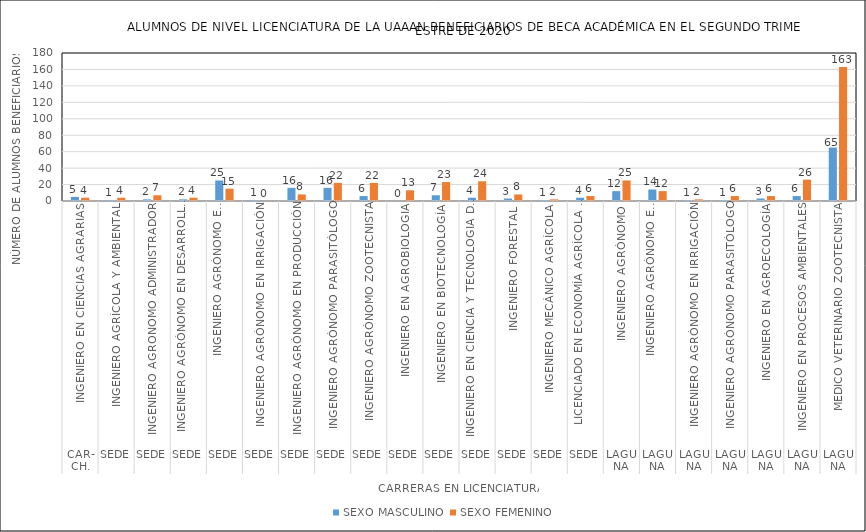
| Category | SEXO MASCULINO | SEXO FEMENINO |
|---|---|---|
| 0 | 5 | 4 |
| 1 | 1 | 4 |
| 2 | 2 | 7 |
| 3 | 2 | 4 |
| 4 | 25 | 15 |
| 5 | 1 | 0 |
| 6 | 16 | 8 |
| 7 | 16 | 22 |
| 8 | 6 | 22 |
| 9 | 0 | 13 |
| 10 | 7 | 23 |
| 11 | 4 | 24 |
| 12 | 3 | 8 |
| 13 | 1 | 2 |
| 14 | 4 | 6 |
| 15 | 12 | 25 |
| 16 | 14 | 12 |
| 17 | 1 | 2 |
| 18 | 1 | 6 |
| 19 | 3 | 6 |
| 20 | 6 | 26 |
| 21 | 65 | 163 |